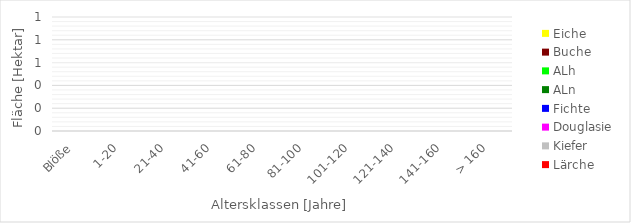
| Category | Lärche | Kiefer | Douglasie | Fichte | ALn | ALh | Buche | Eiche |
|---|---|---|---|---|---|---|---|---|
| 0 | 0 | 0 | 0 | 0 | 0 | 0 | 0 | 0 |
| 1 | 0 | 0 | 0 | 0 | 0 | 0 | 0 | 0 |
| 2 | 0 | 0 | 0 | 0 | 0 | 0 | 0 | 0 |
| 3 | 0 | 0 | 0 | 0 | 0 | 0 | 0 | 0 |
| 4 | 0 | 0 | 0 | 0 | 0 | 0 | 0 | 0 |
| 5 | 0 | 0 | 0 | 0 | 0 | 0 | 0 | 0 |
| 6 | 0 | 0 | 0 | 0 | 0 | 0 | 0 | 0 |
| 7 | 0 | 0 | 0 | 0 | 0 | 0 | 0 | 0 |
| 8 | 0 | 0 | 0 | 0 | 0 | 0 | 0 | 0 |
| 9 | 0 | 0 | 0 | 0 | 0 | 0 | 0 | 0 |